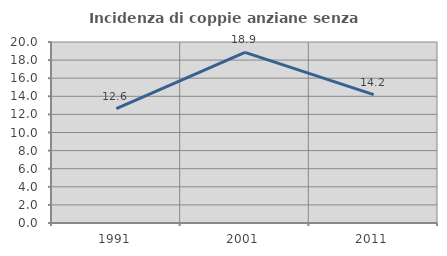
| Category | Incidenza di coppie anziane senza figli  |
|---|---|
| 1991.0 | 12.637 |
| 2001.0 | 18.852 |
| 2011.0 | 14.179 |